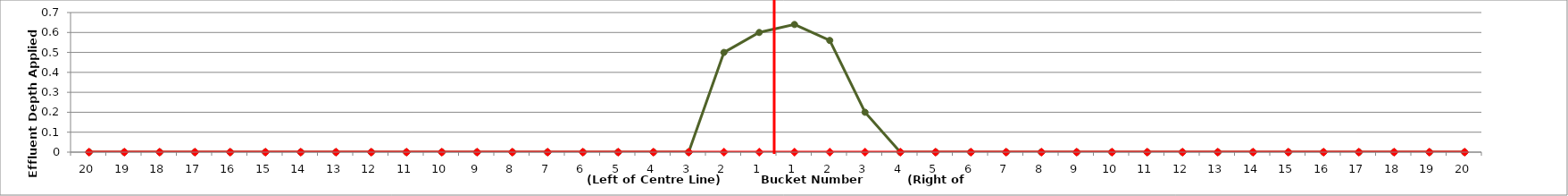
| Category | Series 3 | Series 0 |
|---|---|---|
| 20.0 | 0 | 0 |
| 19.0 | 0 | 0 |
| 18.0 | 0 | 0 |
| 17.0 | 0 | 0 |
| 16.0 | 0 | 0 |
| 15.0 | 0 | 0 |
| 14.0 | 0 | 0 |
| 13.0 | 0 | 0 |
| 12.0 | 0 | 0 |
| 11.0 | 0 | 0 |
| 10.0 | 0 | 0 |
| 9.0 | 0 | 0 |
| 8.0 | 0 | 0 |
| 7.0 | 0 | 0 |
| 6.0 | 0 | 0 |
| 5.0 | 0 | 0 |
| 4.0 | 0 | 0 |
| 3.0 | 0 | 0 |
| 2.0 | 0.5 | 0 |
| 1.0 | 0.6 | 0 |
| 1.0 | 0.64 | 0 |
| 2.0 | 0.56 | 0 |
| 3.0 | 0.2 | 0 |
| 4.0 | 0 | 0 |
| 5.0 | 0 | 0 |
| 6.0 | 0 | 0 |
| 7.0 | 0 | 0 |
| 8.0 | 0 | 0 |
| 9.0 | 0 | 0 |
| 10.0 | 0 | 0 |
| 11.0 | 0 | 0 |
| 12.0 | 0 | 0 |
| 13.0 | 0 | 0 |
| 14.0 | 0 | 0 |
| 15.0 | 0 | 0 |
| 16.0 | 0 | 0 |
| 17.0 | 0 | 0 |
| 18.0 | 0 | 0 |
| 19.0 | 0 | 0 |
| 20.0 | 0 | 0 |